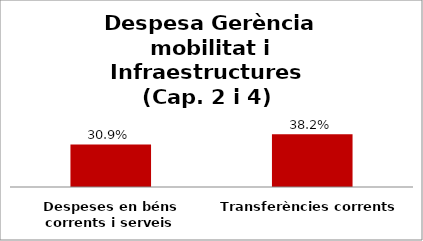
| Category | Series 0 |
|---|---|
| Despeses en béns corrents i serveis | 0.309 |
| Transferències corrents | 0.382 |